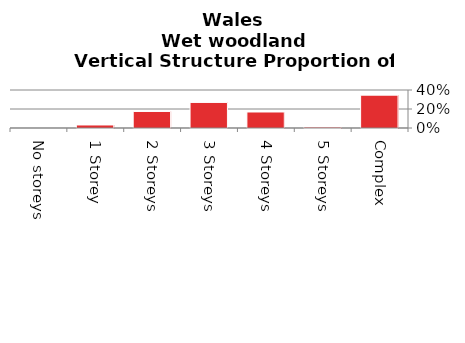
| Category | Wet woodland |
|---|---|
| No storeys | 0 |
| 1 Storey | 0.032 |
| 2 Storeys | 0.174 |
| 3 Storeys | 0.269 |
| 4 Storeys | 0.169 |
| 5 Storeys | 0.011 |
| Complex | 0.346 |